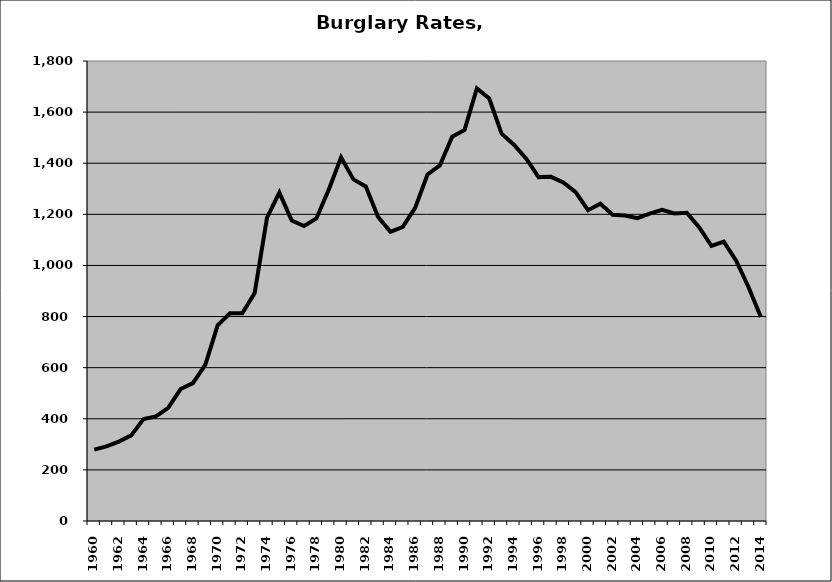
| Category | Burglary |
|---|---|
| 1960.0 | 279.402 |
| 1961.0 | 292.263 |
| 1962.0 | 310.801 |
| 1963.0 | 335.042 |
| 1964.0 | 399.196 |
| 1965.0 | 409.28 |
| 1966.0 | 442.68 |
| 1967.0 | 516.325 |
| 1968.0 | 539.747 |
| 1969.0 | 611.028 |
| 1970.0 | 765.792 |
| 1971.0 | 813.059 |
| 1972.0 | 812.716 |
| 1973.0 | 892.016 |
| 1974.0 | 1186.91 |
| 1975.0 | 1285.104 |
| 1976.0 | 1175.517 |
| 1977.0 | 1154.118 |
| 1978.0 | 1183.988 |
| 1979.0 | 1296.593 |
| 1980.0 | 1422.908 |
| 1981.0 | 1336.666 |
| 1982.0 | 1308.972 |
| 1983.0 | 1189.543 |
| 1984.0 | 1131.338 |
| 1985.0 | 1150.839 |
| 1986.0 | 1225.036 |
| 1987.0 | 1356.058 |
| 1988.0 | 1391.22 |
| 1989.0 | 1503.455 |
| 1990.0 | 1530.39 |
| 1991.0 | 1692.281 |
| 1992.0 | 1653.032 |
| 1993.0 | 1515.767 |
| 1994.0 | 1472.673 |
| 1995.0 | 1417.582 |
| 1996.0 | 1345.61 |
| 1997.0 | 1346.828 |
| 1998.0 | 1324.556 |
| 1999.0 | 1286.887 |
| 2000.0 | 1216.104 |
| 2001.0 | 1241.624 |
| 2002.0 | 1198.377 |
| 2003.0 | 1195.639 |
| 2004.0 | 1184.865 |
| 2005.0 | 1202.635 |
| 2006.0 | 1217.918 |
| 2007.0 | 1203.715 |
| 2008.0 | 1206.222 |
| 2009.0 | 1149.465 |
| 2010.0 | 1076.925 |
| 2011.0 | 1093.492 |
| 2012.0 | 1018.868 |
| 2013.0 | 915.654 |
| 2014.0 | 798.203 |